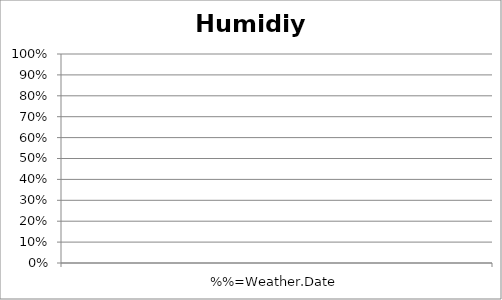
| Category | Rel. Humidity |
|---|---|
| %%=Weather.Date | 0 |